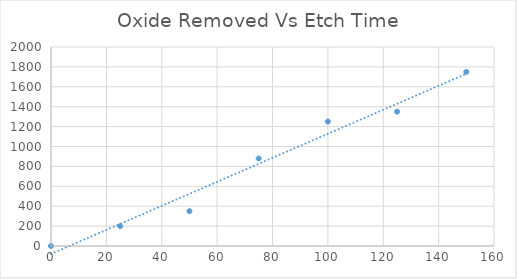
| Category | Series 0 |
|---|---|
| 0.0 | 0 |
| 25.0 | 200 |
| 50.0 | 350 |
| 75.0 | 880 |
| 100.0 | 1250 |
| 125.0 | 1350 |
| 150.0 | 1750 |